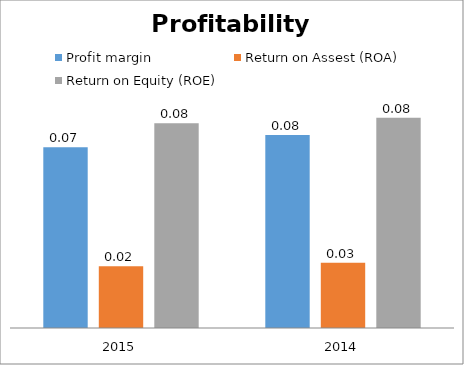
| Category | Profit margin  | Return on Assest (ROA) | Return on Equity (ROE) |
|---|---|---|---|
| 2015.0 | 0.071 | 0.024 | 0.081 |
| 2014.0 | 0.076 | 0.026 | 0.083 |